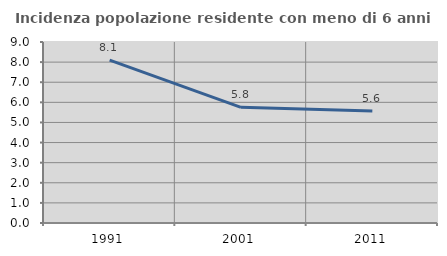
| Category | Incidenza popolazione residente con meno di 6 anni |
|---|---|
| 1991.0 | 8.102 |
| 2001.0 | 5.751 |
| 2011.0 | 5.571 |